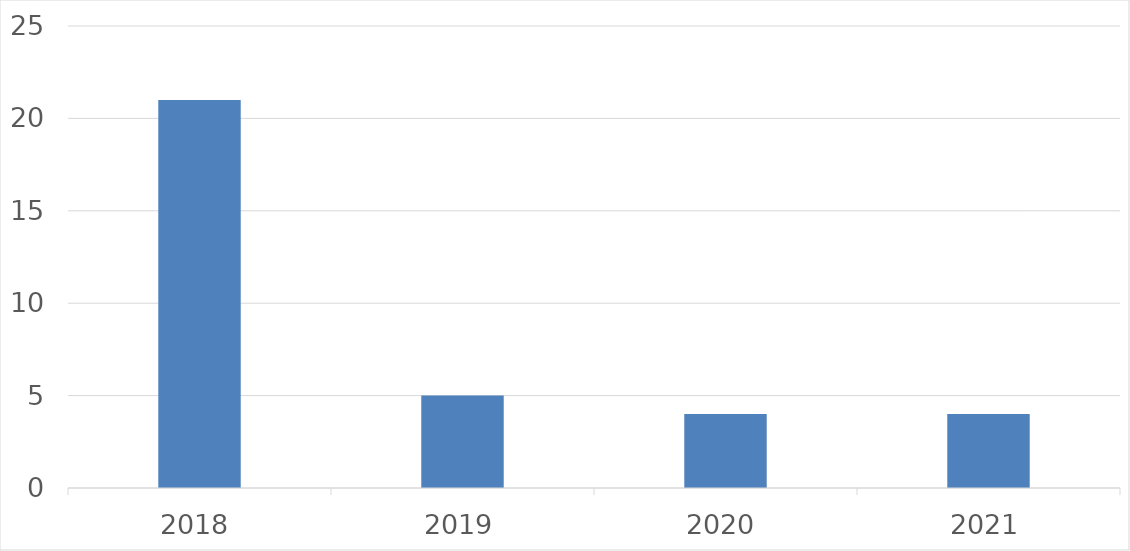
| Category | Series 0 |
|---|---|
| 2018 | 21 |
| 2019 | 5 |
| 2020 | 4 |
| 2021 | 4 |